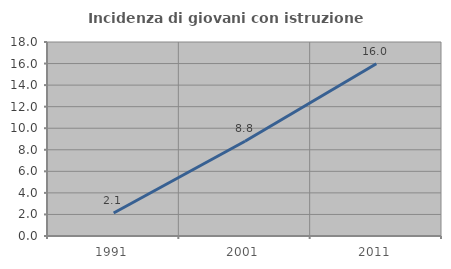
| Category | Incidenza di giovani con istruzione universitaria |
|---|---|
| 1991.0 | 2.131 |
| 2001.0 | 8.786 |
| 2011.0 | 15.987 |